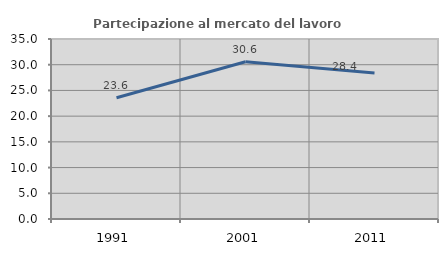
| Category | Partecipazione al mercato del lavoro  femminile |
|---|---|
| 1991.0 | 23.563 |
| 2001.0 | 30.573 |
| 2011.0 | 28.374 |